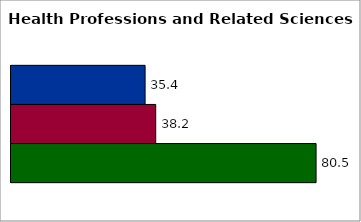
| Category | 50 states and D.C. | SREB states | State |
|---|---|---|---|
| 0 | 35.392 | 38.193 | 80.519 |